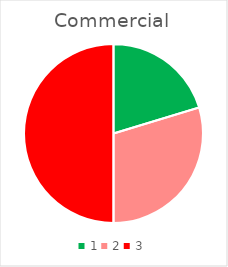
| Category | Series 0 |
|---|---|
| 0 | 0.542 |
| 1 | 0.793 |
| 2 | 1.335 |